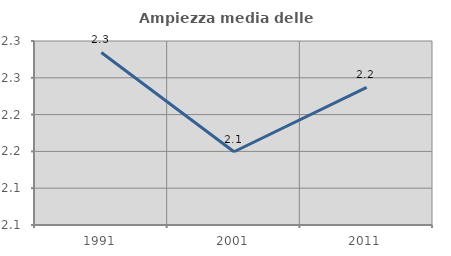
| Category | Ampiezza media delle famiglie |
|---|---|
| 1991.0 | 2.284 |
| 2001.0 | 2.15 |
| 2011.0 | 2.237 |